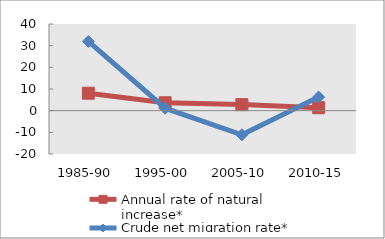
| Category | Annual rate of natural increase* | Crude net migration rate* |
|---|---|---|
| 1985-90 | 8.056 | 31.957 |
| 1995-00 | 3.658 | 1.123 |
| 2005-10 | 2.796 | -11.131 |
| 2010-15 | 1.367 | 6.295 |